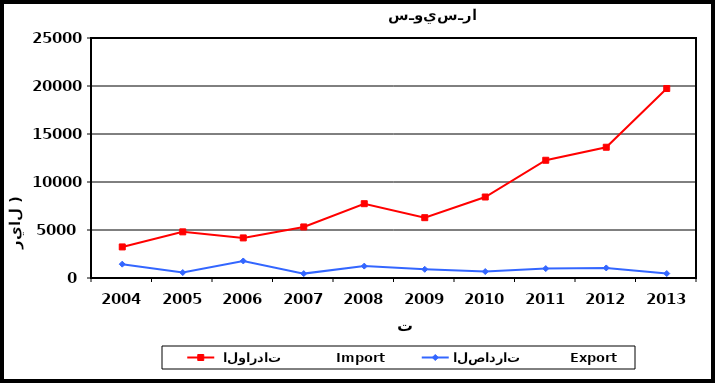
| Category |  الواردات           Import | الصادرات          Export |
|---|---|---|
| 2004.0 | 3236 | 1442 |
| 2005.0 | 4807 | 570 |
| 2006.0 | 4176 | 1774 |
| 2007.0 | 5318 | 457 |
| 2008.0 | 7740 | 1239 |
| 2009.0 | 6283 | 908 |
| 2010.0 | 8437 | 675 |
| 2011.0 | 12264 | 982 |
| 2012.0 | 13620 | 1047 |
| 2013.0 | 19740 | 467 |